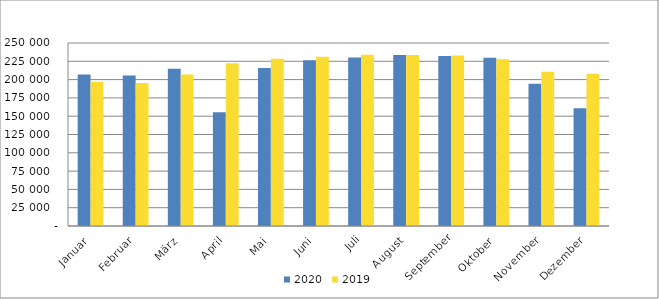
| Category | 2020 | 2019 |
|---|---|---|
| Januar | 207053 | 197233 |
| Februar | 205695 | 195227 |
| März | 214768 | 207079 |
| April | 155433 | 222430 |
| Mai | 215701 | 228514 |
| Juni | 226300 | 231048 |
| Juli | 230123 | 233904 |
| August | 233456 | 233468 |
| September | 232266 | 232871 |
| Oktober | 229785 | 227830 |
| November | 194308 | 210604 |
| Dezember | 160807 | 208136 |